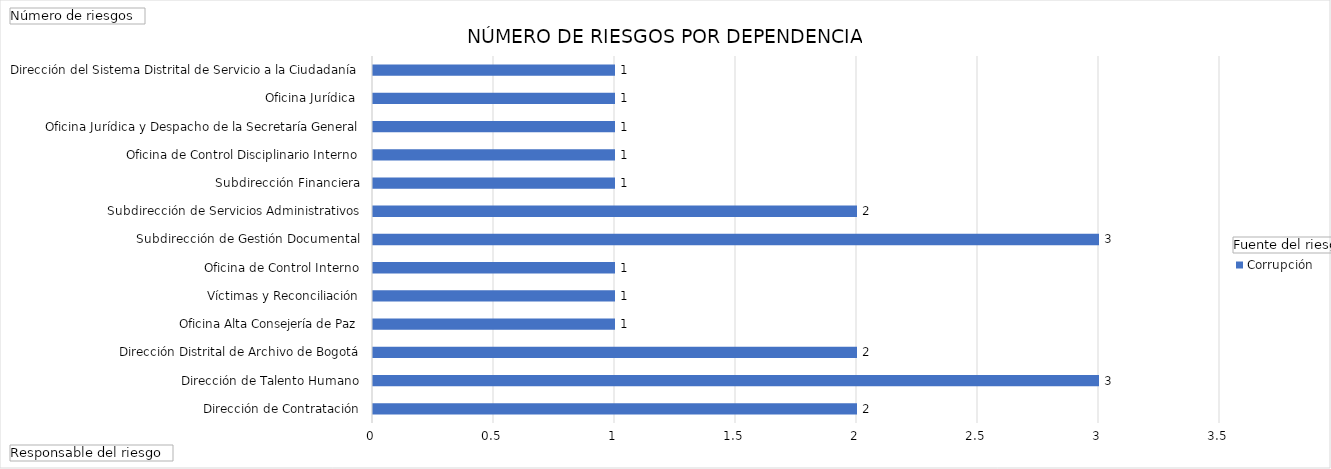
| Category | Corrupción |
|---|---|
| Dirección de Contratación | 2 |
| Dirección de Talento Humano | 3 |
| Dirección Distrital de Archivo de Bogotá | 2 |
| Oficina Alta Consejería de Paz, Víctimas y Reconciliación | 1 |
| Oficina de Control Interno | 1 |
| Subdirección de Gestión Documental | 1 |
| Subdirección de Servicios Administrativos | 3 |
| Subdirección Financiera | 2 |
| Oficina de Control Disciplinario Interno, Oficina Jurídica y Despacho de la Secretaría General | 1 |
| Oficina Jurídica  | 1 |
| Dirección del Sistema Distrital de Servicio a la Ciudadanía | 1 |
| Dirección Distrital de Calidad del Servicio  | 1 |
| Oficina de Alta Consejería Distrital de Tecnologías de Información y Comunicaciones –TIC | 1 |